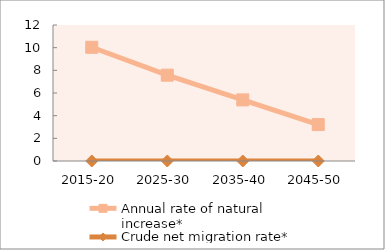
| Category | Annual rate of natural increase* | Crude net migration rate* |
|---|---|---|
| 2015-20 | 10.035 | 0 |
| 2025-30 | 7.572 | 0 |
| 2035-40 | 5.392 | 0 |
| 2045-50 | 3.215 | 0 |